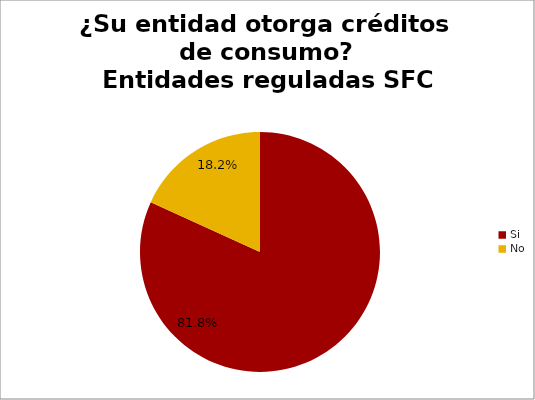
| Category | ¿Su entidad otorga créditos de consumo? Entidades reguladas SFC |
|---|---|
| Si | 0.818 |
| No | 0.182 |